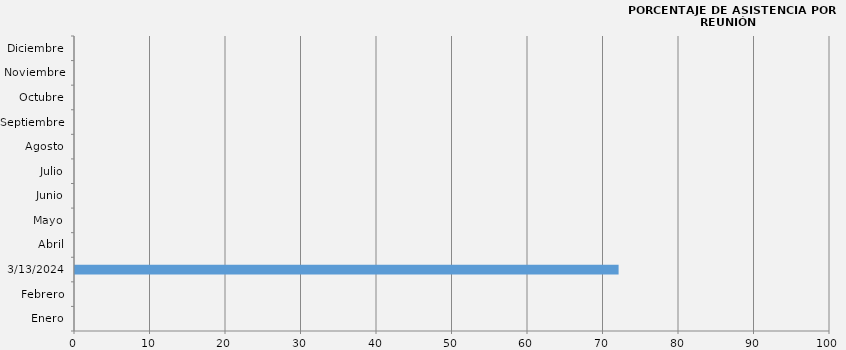
| Category | Enero |
|---|---|
| Enero | 0 |
| Febrero | 0 |
| 13/03/2024 | 72 |
| Abril | 0 |
| Mayo | 0 |
| Junio | 0 |
| Julio | 0 |
| Agosto | 0 |
| Septiembre | 0 |
| Octubre | 0 |
| Noviembre | 0 |
| Diciembre | 0 |